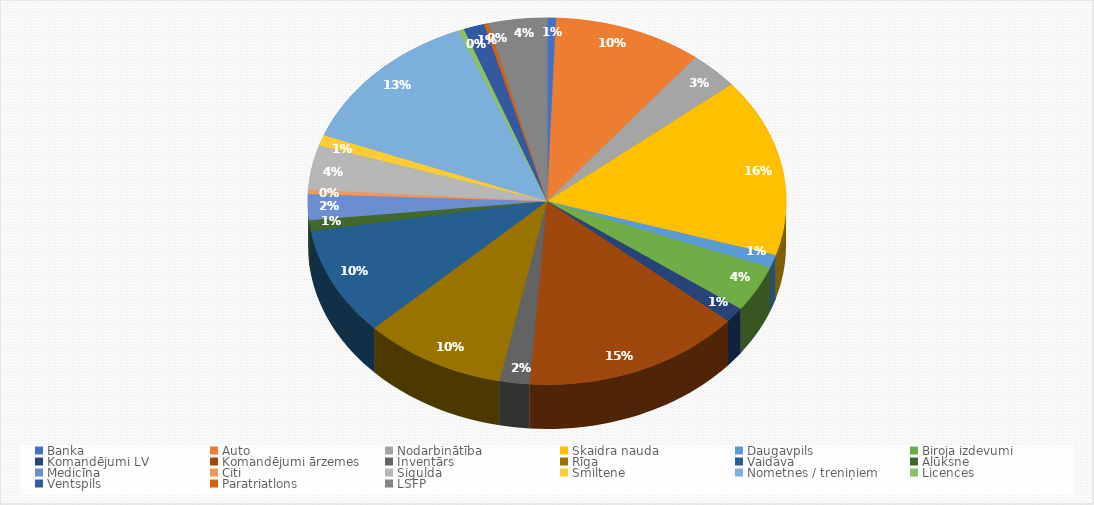
| Category | Series 0 |
|---|---|
| Banka | 284.66 |
| Auto | 4815.27 |
| Nodarbinātība | 1608.92 |
| Skaidra nauda | 7529 |
| Daugavpils | 542.3 |
| Biroja izdevumi | 1965.78 |
| Komandējumi LV | 639 |
| Komandējumi ārzemes | 7090.82 |
| Inventārs | 972.35 |
| Rīga | 4621.03 |
| Vaidava | 4575.33 |
| Alūksne | 456.89 |
| Medicīna | 1078.09 |
| Citi | 192.5 |
| Sigulda | 1874.49 |
| Smiltene | 450 |
| Nometnes / treniņiem | 6255 |
| Licences | 200.38 |
| Ventspils | 674.2 |
| Paratriatlons | 133.99 |
| LSFP | 1893.4 |